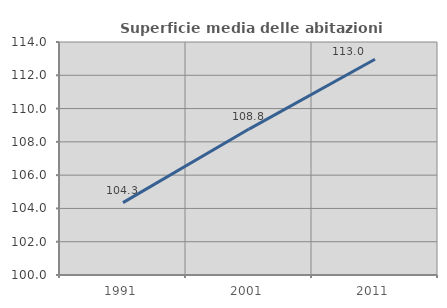
| Category | Superficie media delle abitazioni occupate |
|---|---|
| 1991.0 | 104.346 |
| 2001.0 | 108.768 |
| 2011.0 | 112.961 |